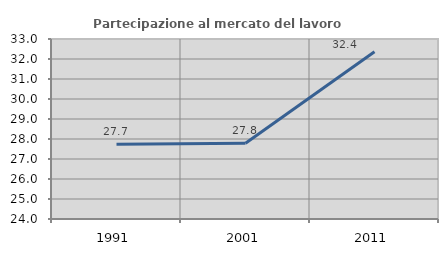
| Category | Partecipazione al mercato del lavoro  femminile |
|---|---|
| 1991.0 | 27.738 |
| 2001.0 | 27.786 |
| 2011.0 | 32.364 |